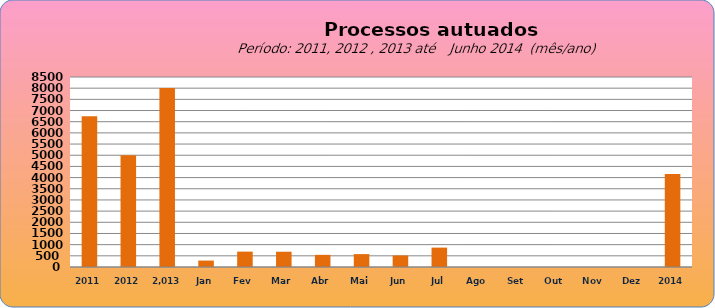
| Category | 6749 4998  8.003   288  688 684 543 577 516 867 0 0 0 0 0 |
|---|---|
| 2011 | 6749 |
| 2012 | 4998 |
|  2.013  | 8003 |
| Jan | 288 |
| Fev | 688 |
| Mar | 684 |
| Abr | 543 |
| Mai | 577 |
| Jun | 516 |
| Jul | 867 |
| Ago | 0 |
| Set | 0 |
| Out | 0 |
| Nov | 0 |
| Dez | 0 |
| 2014 | 4161 |